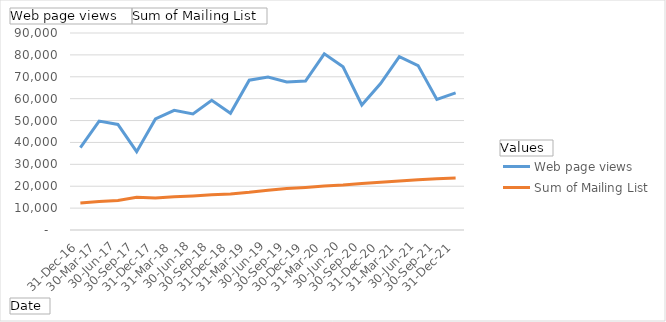
| Category | Web page views  | Sum of Mailing List |
|---|---|---|
| 31-Dec-16 | 37669 | 12348 |
| 30-Mar-17 | 49730 | 13039 |
| 30-Jun-17 | 48242 | 13463 |
| 30-Sep-17 | 35780 | 14981 |
| 31-Dec-17 | 50705 | 14629 |
| 31-Mar-18 | 54689 | 15174 |
| 30-Jun-18 | 53046 | 15546 |
| 30-Sep-18 | 59278 | 16102 |
| 31-Dec-18 | 53339 | 16456 |
| 31-Mar-19 | 68455 | 17221 |
| 30-Jun-19 | 69888 | 18192 |
| 30-Sep-19 | 67662 | 18983 |
| 30-Dec-19 | 68019 | 19470 |
| 31-Mar-20 | 80472 | 20092 |
| 30-Jun-20 | 74564 | 20572 |
| 30-Sep-20 | 57126 | 21284 |
| 31-Dec-20 | 66908 | 21814 |
| 31-Mar-21 | 79239 | 22397 |
| 30-Jun-21 | 75123 | 22926 |
| 30-Sep-21 | 59676 | 23439 |
| 31-Dec-21 | 62617 | 23776 |